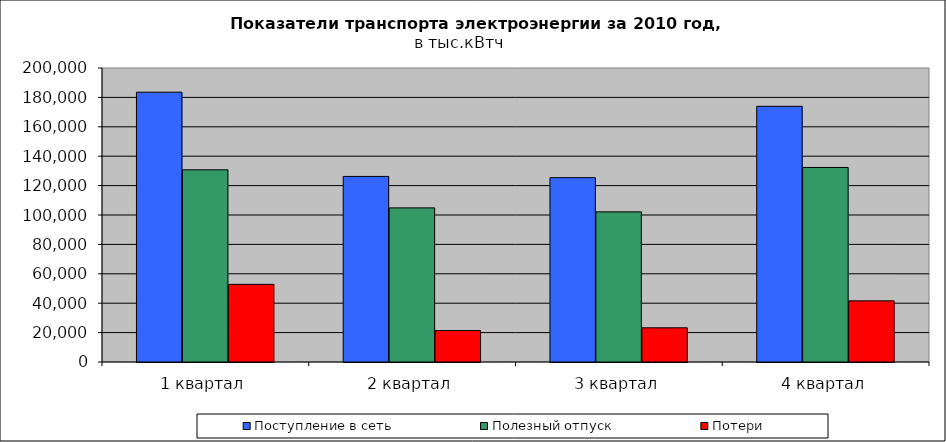
| Category | Поступление в сеть | Полезный отпуск | Потери |
|---|---|---|---|
| 1 квартал | 183537.19 | 130725.603 | 52811.587 |
| 2 квартал | 126237.221 | 104840.882 | 21396.339 |
| 3 квартал | 125395.349 | 102131.384 | 23263.965 |
| 4 квартал | 173938.36 | 132339.233 | 41599.127 |